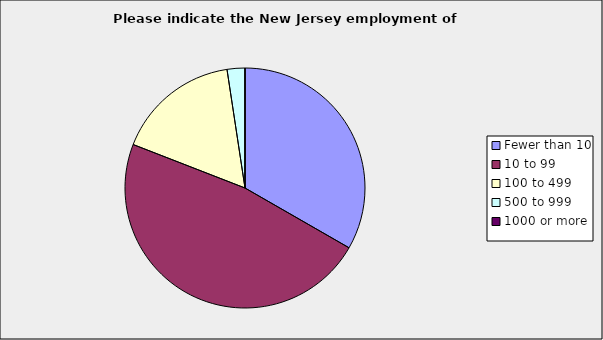
| Category | Series 0 |
|---|---|
| Fewer than 10 | 0.333 |
| 10 to 99 | 0.476 |
| 100 to 499 | 0.167 |
| 500 to 999 | 0.024 |
| 1000 or more | 0 |